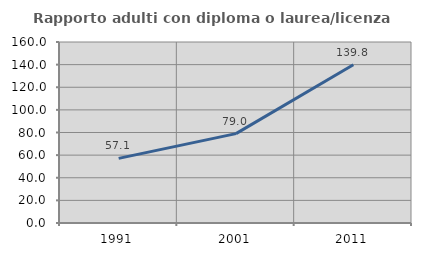
| Category | Rapporto adulti con diploma o laurea/licenza media  |
|---|---|
| 1991.0 | 57.113 |
| 2001.0 | 79.021 |
| 2011.0 | 139.819 |